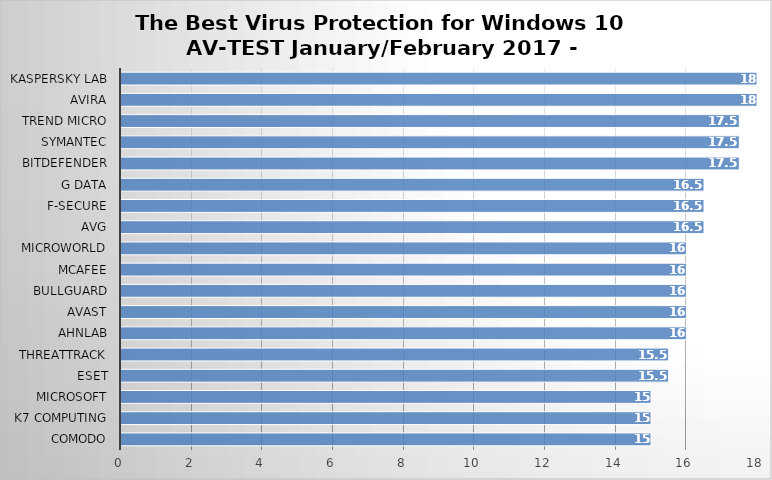
| Category | Series 0 |
|---|---|
| Comodo | 15 |
| K7 Computing | 15 |
| Microsoft | 15 |
| ESET | 15.5 |
| ThreatTrack | 15.5 |
| AhnLab | 16 |
| Avast | 16 |
| BullGuard | 16 |
| McAfee | 16 |
| Microworld | 16 |
| AVG | 16.5 |
| F-Secure | 16.5 |
| G Data | 16.5 |
| Bitdefender | 17.5 |
| Symantec | 17.5 |
| Trend Micro | 17.5 |
| Avira | 18 |
| Kaspersky Lab | 18 |